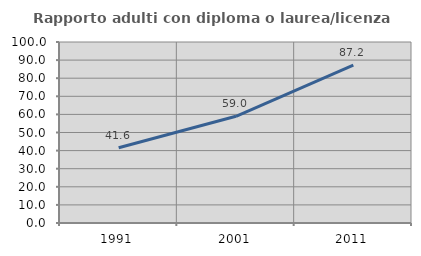
| Category | Rapporto adulti con diploma o laurea/licenza media  |
|---|---|
| 1991.0 | 41.564 |
| 2001.0 | 58.957 |
| 2011.0 | 87.225 |